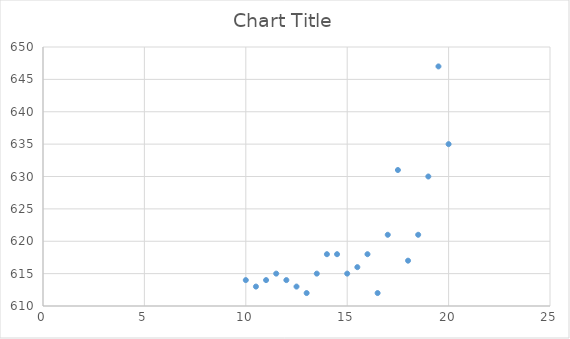
| Category | Series 0 |
|---|---|
| 20.0 | 635 |
| 19.5 | 647 |
| 19.0 | 630 |
| 18.5 | 621 |
| 18.0 | 617 |
| 17.5 | 631 |
| 17.0 | 621 |
| 16.5 | 612 |
| 16.0 | 618 |
| 15.5 | 616 |
| 15.0 | 615 |
| 14.5 | 618 |
| 14.0 | 618 |
| 13.5 | 615 |
| 13.0 | 612 |
| 12.5 | 613 |
| 12.0 | 614 |
| 11.5 | 615 |
| 11.0 | 614 |
| 10.5 | 613 |
| 10.0 | 614 |